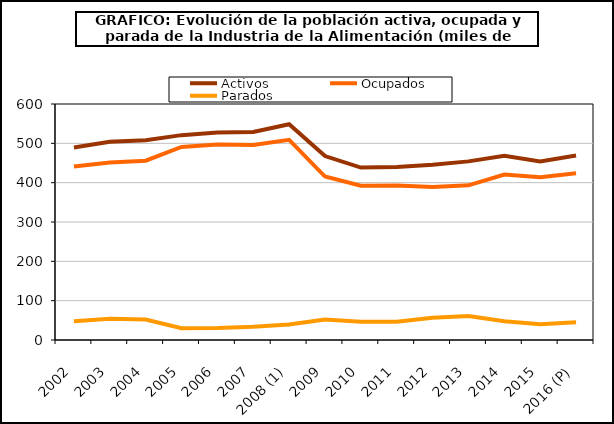
| Category | Activos | Ocupados | Parados |
|---|---|---|---|
| 2002 | 489.575 | 441 | 47.8 |
| 2003 | 504 | 451.5 | 54 |
| 2004 | 508.05 | 455.9 | 52.175 |
| 2005 | 520.85 | 490.7 | 30.15 |
| 2006 | 527.375 | 496.9 | 30.475 |
| 2007 | 529 | 495.6 | 33.4 |
| 2008 (1) | 548.65 | 509 | 39.7 |
| 2009 | 467.6 | 415.6 | 52 |
| 2010 | 438.425 | 392.275 | 46.2 |
| 2011 | 439.6 | 393.1 | 46.5 |
| 2012 | 445.725 | 388.925 | 56.8 |
| 2013 | 454.1 | 393.3 | 60.8 |
| 2014 | 468.5 | 420.7 | 47.8 |
| 2015 | 454.1 | 414 | 40.1 |
| 2016 (P) | 468.925 | 423.675 | 45.25 |